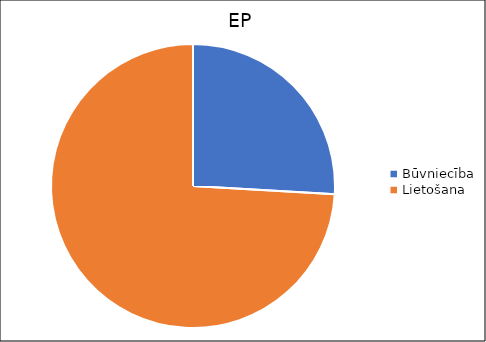
| Category | Series 0 |
|---|---|
| Būvniecība | 0.001 |
| Lietošana | 0.004 |